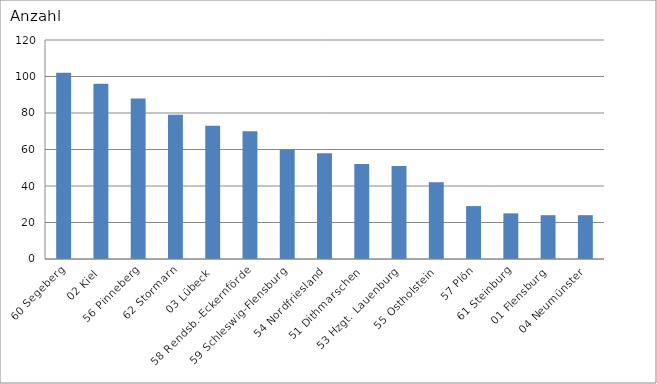
| Category | 60 Segeberg 02 Kiel 56 Pinneberg 62 Stormarn 03 Lübeck 58 Rendsb.-Eckernförde 59 Schleswig-Flensburg 54 Nordfriesland 51 Dithmarschen 53 Hzgt. Lauenburg 55 Ostholstein 57 Plön 61 Steinburg 01 Flensburg 04 Neumünster |
|---|---|
| 60 Segeberg | 102 |
| 02 Kiel | 96 |
| 56 Pinneberg | 88 |
| 62 Stormarn | 79 |
| 03 Lübeck | 73 |
| 58 Rendsb.-Eckernförde | 70 |
| 59 Schleswig-Flensburg | 60 |
| 54 Nordfriesland | 58 |
| 51 Dithmarschen | 52 |
| 53 Hzgt. Lauenburg | 51 |
| 55 Ostholstein | 42 |
| 57 Plön | 29 |
| 61 Steinburg | 25 |
| 01 Flensburg | 24 |
| 04 Neumünster | 24 |